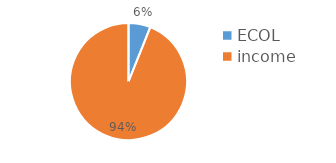
| Category | ECOL |
|---|---|
| ECOL | 5607 |
| income | 86868 |